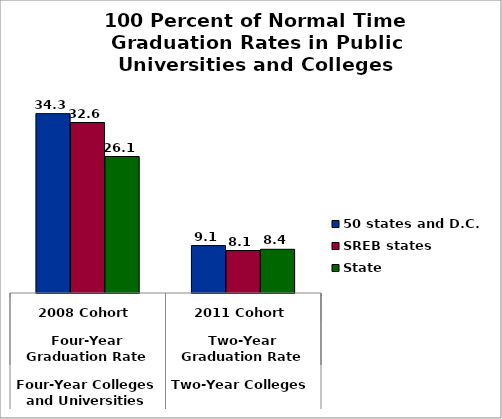
| Category | 50 states and D.C. | SREB states | State |
|---|---|---|---|
| 0 | 34.329 | 32.631 | 26.121 |
| 1 | 9.073 | 8.126 | 8.366 |